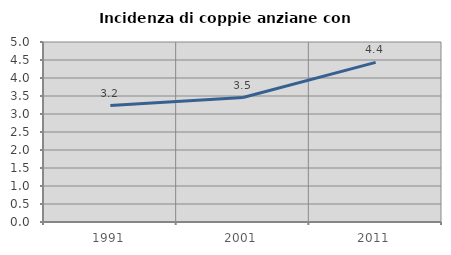
| Category | Incidenza di coppie anziane con figli |
|---|---|
| 1991.0 | 3.235 |
| 2001.0 | 3.457 |
| 2011.0 | 4.433 |